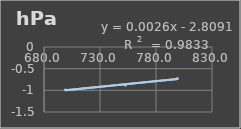
| Category | Presión Atmosférica |
|---|---|
| 699.2 | -0.99 |
| 752.7 | -0.88 |
| 799.1 | -0.73 |